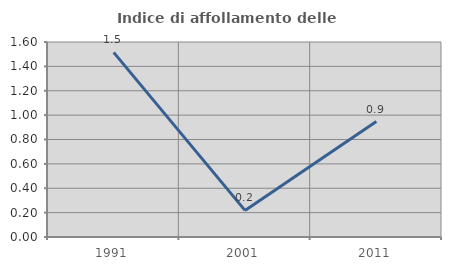
| Category | Indice di affollamento delle abitazioni  |
|---|---|
| 1991.0 | 1.515 |
| 2001.0 | 0.218 |
| 2011.0 | 0.947 |